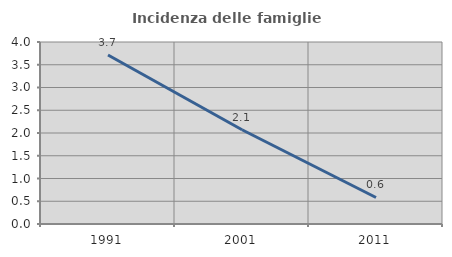
| Category | Incidenza delle famiglie numerose |
|---|---|
| 1991.0 | 3.715 |
| 2001.0 | 2.071 |
| 2011.0 | 0.583 |